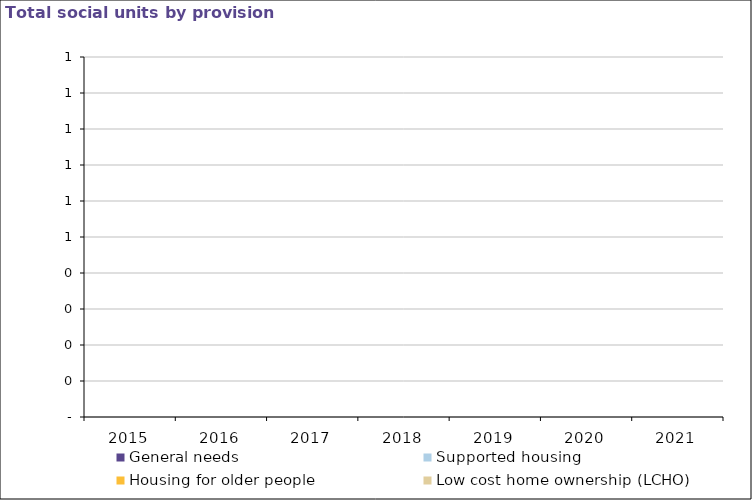
| Category | General needs | Supported housing | Housing for older people | Low cost home ownership (LCHO) |
|---|---|---|---|---|
| 2015.0 | 0 | 0 | 0 | 0 |
| 2016.0 | 0 | 0 | 0 | 0 |
| 2017.0 | 0 | 0 | 0 | 0 |
| 2018.0 | 0 | 0 | 0 | 0 |
| 2019.0 | 0 | 0 | 0 | 0 |
| 2020.0 | 0 | 0 | 0 | 0 |
| 2021.0 | 0 | 0 | 0 | 0 |